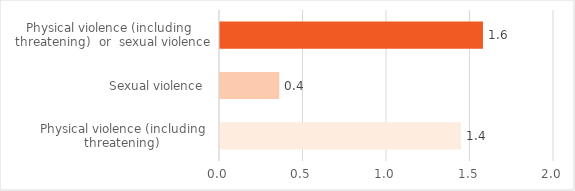
| Category | % |
|---|---|
| Physical violence (including
threatening)  | 1.443 |
| Sexual violence  | 0.355 |
| Physical violence (including  
threatening)  or  sexual violence | 1.575 |